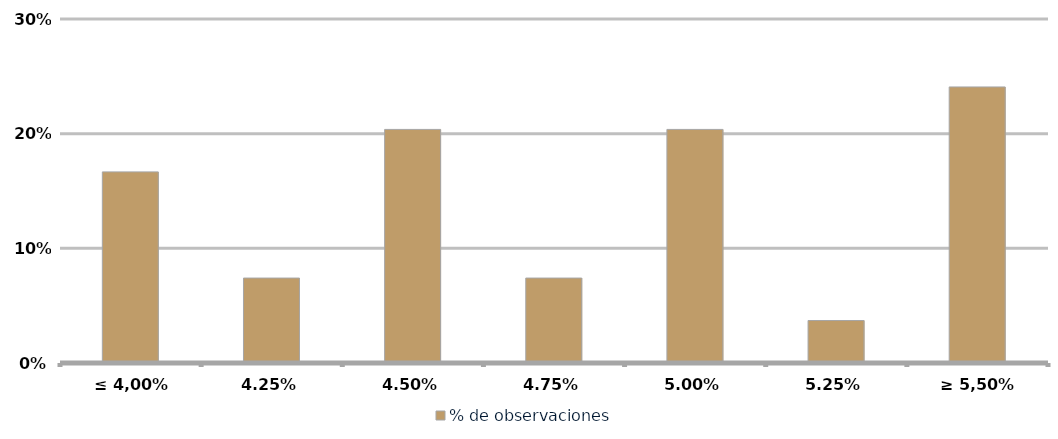
| Category | % de observaciones  |
|---|---|
| ≤ 4,00% | 0.167 |
| 4,25% | 0.074 |
| 4,50% | 0.204 |
| 4,75% | 0.074 |
| 5,00% | 0.204 |
| 5,25% | 0.037 |
| ≥ 5,50% | 0.241 |